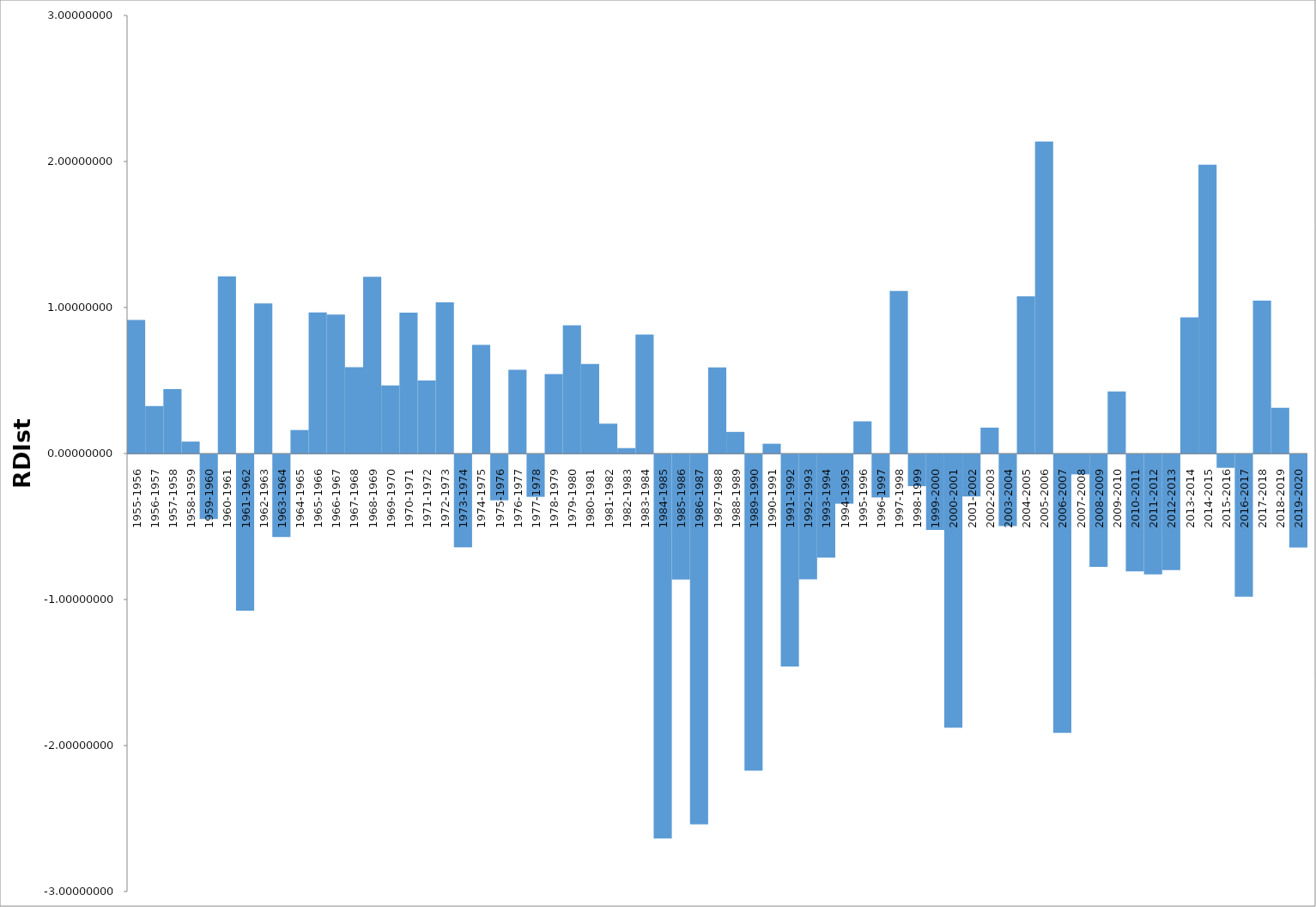
| Category | Series 0 |
|---|---|
| 1955-1956 | 0.915 |
| 1956-1957 | 0.326 |
| 1957-1958 | 0.441 |
| 1958-1959 | 0.082 |
| 1959-1960 | -0.443 |
| 1960-1961 | 1.213 |
| 1961-1962 | -1.071 |
| 1962-1963 | 1.029 |
| 1963-1964 | -0.566 |
| 1964-1965 | 0.161 |
| 1965-1966 | 0.966 |
| 1966-1967 | 0.951 |
| 1967-1968 | 0.591 |
| 1968-1969 | 1.21 |
| 1969-1970 | 0.467 |
| 1970-1971 | 0.965 |
| 1971-1972 | 0.5 |
| 1972-1973 | 1.035 |
| 1973-1974 | -0.636 |
| 1974-1975 | 0.744 |
| 1975-1976 | -0.314 |
| 1976-1977 | 0.574 |
| 1977-1978 | -0.292 |
| 1978-1979 | 0.544 |
| 1979-1980 | 0.877 |
| 1980-1981 | 0.613 |
| 1981-1982 | 0.204 |
| 1982-1983 | 0.037 |
| 1983-1984 | 0.815 |
| 1984-1985 | -2.631 |
| 1985-1986 | -0.857 |
| 1986-1987 | -2.534 |
| 1987-1988 | 0.589 |
| 1988-1989 | 0.148 |
| 1989-1990 | -2.166 |
| 1990-1991 | 0.067 |
| 1991-1992 | -1.453 |
| 1992-1993 | -0.856 |
| 1993-1994 | -0.708 |
| 1994-1995 | -0.338 |
| 1995-1996 | 0.22 |
| 1996-1997 | -0.296 |
| 1997-1998 | 1.114 |
| 1998-1999 | -0.218 |
| 1999-2000 | -0.518 |
| 2000-2001 | -1.872 |
| 2001-2002 | -0.288 |
| 2002-2003 | 0.177 |
| 2003-2004 | -0.491 |
| 2004-2005 | 1.077 |
| 2005-2006 | 2.137 |
| 2006-2007 | -1.908 |
| 2007-2008 | -0.137 |
| 2008-2009 | -0.771 |
| 2009-2010 | 0.426 |
| 2010-2011 | -0.802 |
| 2011-2012 | -0.822 |
| 2012-2013 | -0.793 |
| 2013-2014 | 0.933 |
| 2014-2015 | 1.978 |
| 2015-2016 | -0.092 |
| 2016-2017 | -0.975 |
| 2017-2018 | 1.047 |
| 2018-2019 | 0.314 |
| 2019-2020 | -0.638 |